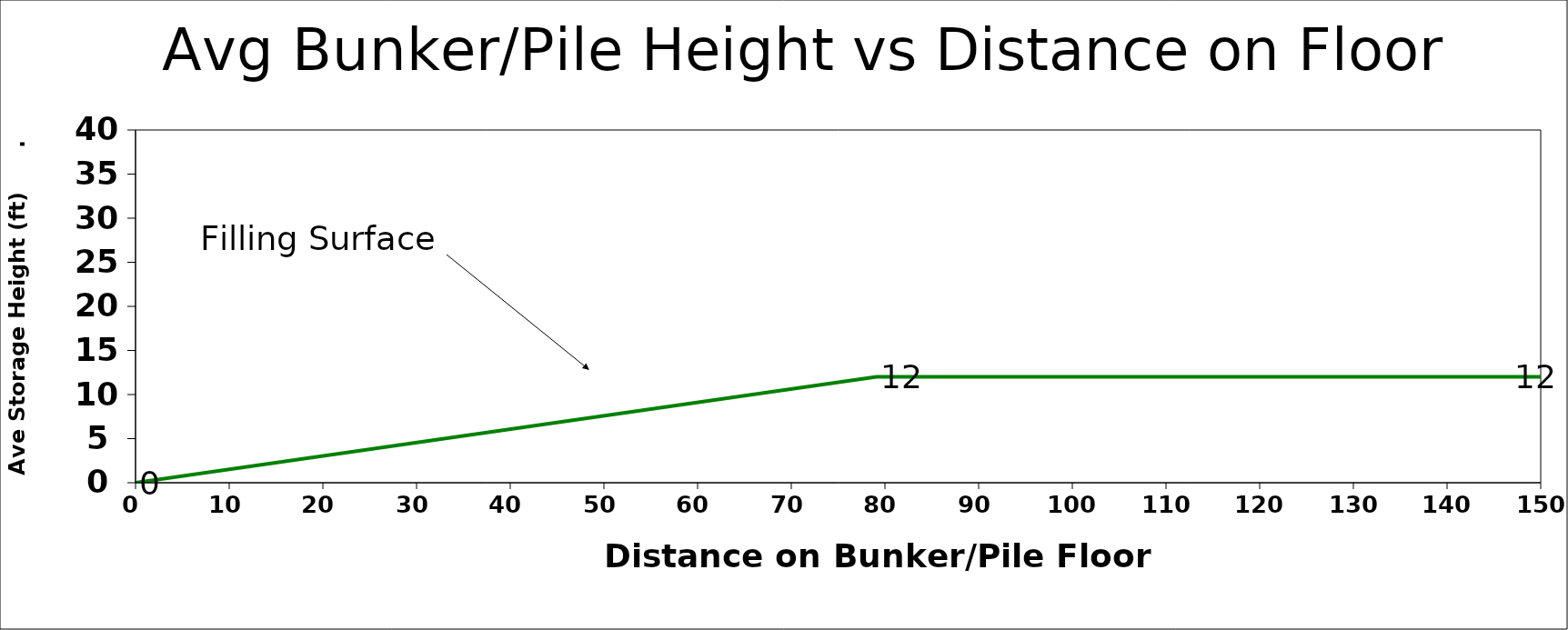
| Category | Cross Section |
|---|---|
| 0.0 | 0 |
| 79.09487973314074 | 12 |
| 150.0 | 12 |